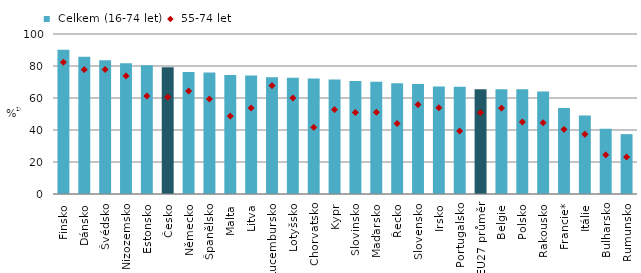
| Category |  Celkem (16-74 let) |
|---|---|
| Finsko | 90.103 |
| Dánsko | 85.818 |
| Švédsko | 83.582 |
| Nizozemsko | 81.663 |
| Estonsko | 80.477 |
| Česko | 79.242 |
| Německo | 76.3 |
| Španělsko | 75.924 |
| Malta | 74.426 |
| Litva | 73.991 |
| Lucembursko | 72.923 |
| Lotyšsko | 72.62 |
| Chorvatsko | 72.229 |
| Kypr | 71.52 |
| Slovinsko | 70.608 |
| Maďarsko | 70.171 |
| Řecko | 69.161 |
| Slovensko | 68.689 |
| Irsko | 67.165 |
| Portugalsko | 67.073 |
| EU27 průměr | 65.501 |
| Belgie | 65.413 |
| Polsko | 65.402 |
| Rakousko | 63.998 |
| Francie* | 53.782 |
| Itálie | 49.098 |
| Bulharsko | 40.822 |
| Rumunsko | 37.407 |